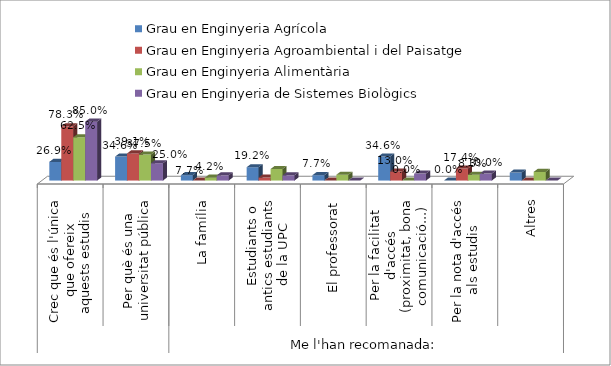
| Category | Grau en Enginyeria Agrícola | Grau en Enginyeria Agroambiental i del Paisatge | Grau en Enginyeria Alimentària | Grau en Enginyeria de Sistemes Biològics |
|---|---|---|---|---|
| 0 | 0.269 | 0.783 | 0.625 | 0.85 |
| 1 | 0.346 | 0.391 | 0.375 | 0.25 |
| 2 | 0.077 | 0 | 0.042 | 0.075 |
| 3 | 0.192 | 0.043 | 0.167 | 0.075 |
| 4 | 0.077 | 0 | 0.083 | 0 |
| 5 | 0.346 | 0.13 | 0 | 0.1 |
| 6 | 0 | 0.174 | 0.083 | 0.1 |
| 7 | 0.115 | 0 | 0.125 | 0 |